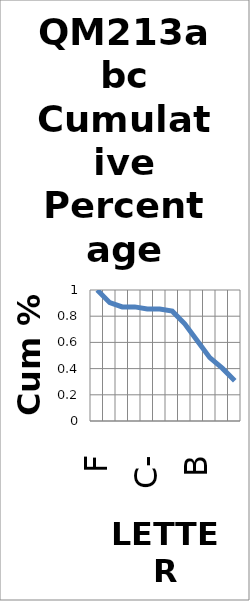
| Category | Series 0 |
|---|---|
| F | 1 |
| D- | 0.903 |
| D | 0.871 |
| D+ | 0.871 |
| C- | 0.855 |
| C | 0.855 |
| C+ | 0.839 |
| B- | 0.742 |
| B | 0.613 |
| B+ | 0.484 |
| A- | 0.403 |
| A | 0.306 |